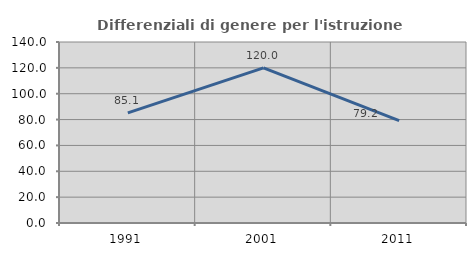
| Category | Differenziali di genere per l'istruzione superiore |
|---|---|
| 1991.0 | 85.147 |
| 2001.0 | 119.978 |
| 2011.0 | 79.197 |